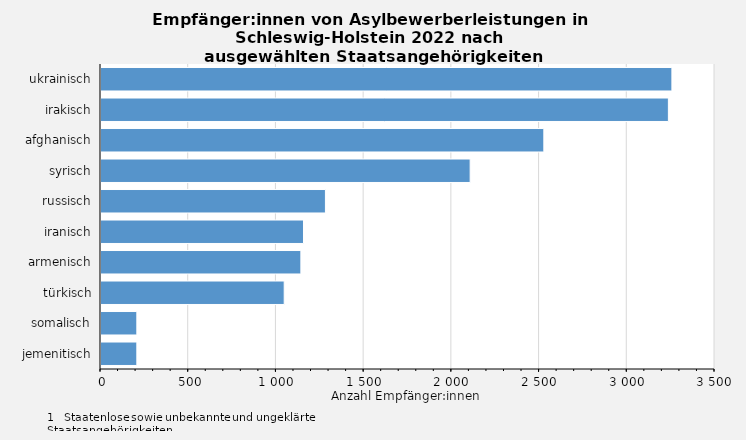
| Category | Series 0 |
|---|---|
| ukrainisch | 3260 |
| irakisch | 3240 |
| afghanisch | 2530 |
| syrisch | 2110 |
| russisch | 1285 |
| iranisch | 1160 |
| armenisch | 1145 |
| türkisch | 1050 |
| somalisch | 210 |
| jemenitisch | 210 |